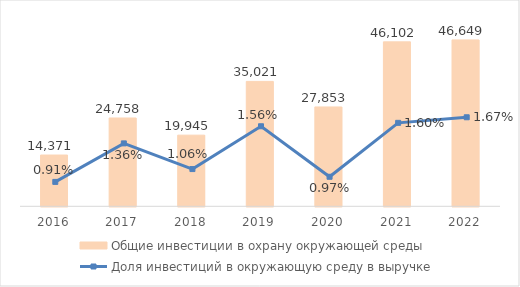
| Category | Общие инвестиции в охрану окружающей среды |
|---|---|
| 2016.0 | 14371 |
| 2017.0 | 24758 |
| 2018.0 | 19945.402 |
| 2019.0 | 35021.267 |
| 2020.0 | 27853.037 |
| 2021.0 | 46102 |
| 2022.0 | 46649 |